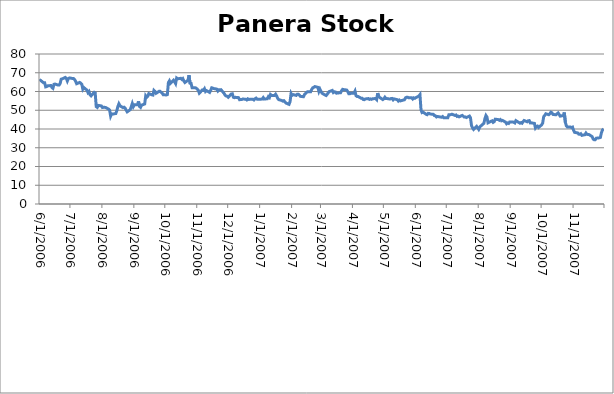
| Category | Panera Stock Price |
|---|---|
| 6/1/06 | 65.53 |
| 6/2/06 | 65.95 |
| 6/5/06 | 64.62 |
| 6/6/06 | 64.62 |
| 6/7/06 | 62.47 |
| 6/8/06 | 62.62 |
| 6/9/06 | 63.04 |
| 6/12/06 | 63.18 |
| 6/13/06 | 62.14 |
| 6/14/06 | 61.7 |
| 6/15/06 | 63.83 |
| 6/16/06 | 63.99 |
| 6/19/06 | 63.41 |
| 6/20/06 | 63.42 |
| 6/21/06 | 64.29 |
| 6/22/06 | 66.57 |
| 6/23/06 | 66.73 |
| 6/26/06 | 67.5 |
| 6/27/06 | 67.03 |
| 6/28/06 | 65.58 |
| 6/29/06 | 66.87 |
| 6/30/06 | 67.24 |
| 7/3/06 | 66.94 |
| 7/4/06 | 66.94 |
| 7/5/06 | 66.37 |
| 7/6/06 | 65.5 |
| 7/7/06 | 64.15 |
| 7/10/06 | 64.83 |
| 7/11/06 | 64.44 |
| 7/12/06 | 63.83 |
| 7/13/06 | 61.25 |
| 7/14/06 | 62.1 |
| 7/17/06 | 60.71 |
| 7/18/06 | 59.41 |
| 7/19/06 | 60.01 |
| 7/20/06 | 58.25 |
| 7/21/06 | 57.69 |
| 7/24/06 | 59.56 |
| 7/25/06 | 59.27 |
| 7/26/06 | 51.93 |
| 7/27/06 | 51.53 |
| 7/28/06 | 52.59 |
| 7/31/06 | 52.31 |
| 8/1/06 | 51.45 |
| 8/2/06 | 51.54 |
| 8/3/06 | 51.56 |
| 8/4/06 | 51.5 |
| 8/7/06 | 50.61 |
| 8/8/06 | 50.1 |
| 8/9/06 | 46.85 |
| 8/10/06 | 48.08 |
| 8/11/06 | 47.95 |
| 8/14/06 | 48.26 |
| 8/15/06 | 49.81 |
| 8/16/06 | 51.96 |
| 8/17/06 | 53.46 |
| 8/18/06 | 52.4 |
| 8/21/06 | 51.39 |
| 8/22/06 | 51.62 |
| 8/23/06 | 51.15 |
| 8/24/06 | 50.12 |
| 8/25/06 | 49.16 |
| 8/28/06 | 50.29 |
| 8/29/06 | 51.9 |
| 8/30/06 | 53.6 |
| 8/31/06 | 51.9 |
| 9/1/06 | 52.88 |
| 9/4/06 | 52.88 |
| 9/5/06 | 54.75 |
| 9/6/06 | 52.03 |
| 9/7/06 | 51.52 |
| 9/8/06 | 52.72 |
| 9/11/06 | 53.35 |
| 9/12/06 | 57.67 |
| 9/13/06 | 56.89 |
| 9/14/06 | 57.46 |
| 9/15/06 | 58.9 |
| 9/18/06 | 58.22 |
| 9/19/06 | 58.09 |
| 9/20/06 | 60.6 |
| 9/21/06 | 60.08 |
| 9/22/06 | 59.03 |
| 9/25/06 | 60.11 |
| 9/26/06 | 60.11 |
| 9/27/06 | 59.57 |
| 9/28/06 | 59.1 |
| 9/29/06 | 58.25 |
| 10/2/06 | 58.17 |
| 10/3/06 | 58.35 |
| 10/4/06 | 64.75 |
| 10/5/06 | 65.68 |
| 10/6/06 | 64.41 |
| 10/9/06 | 66.02 |
| 10/10/06 | 65.19 |
| 10/11/06 | 64.22 |
| 10/12/06 | 67.2 |
| 10/13/06 | 66.8 |
| 10/16/06 | 67.03 |
| 10/17/06 | 66.47 |
| 10/18/06 | 66.9 |
| 10/19/06 | 65.58 |
| 10/20/06 | 64.79 |
| 10/23/06 | 66.01 |
| 10/24/06 | 68.7 |
| 10/25/06 | 64.41 |
| 10/26/06 | 64.33 |
| 10/27/06 | 62.03 |
| 10/30/06 | 61.98 |
| 10/31/06 | 61.8 |
| 11/1/06 | 61.27 |
| 11/2/06 | 60.66 |
| 11/3/06 | 59.15 |
| 11/6/06 | 60.83 |
| 11/7/06 | 60.64 |
| 11/8/06 | 61.47 |
| 11/9/06 | 59.99 |
| 11/10/06 | 60.47 |
| 11/13/06 | 59.52 |
| 11/14/06 | 60.58 |
| 11/15/06 | 61.97 |
| 11/16/06 | 61.82 |
| 11/17/06 | 61.58 |
| 11/20/06 | 61.26 |
| 11/21/06 | 60.25 |
| 11/22/06 | 60.87 |
| 11/23/06 | 60.87 |
| 11/24/06 | 60.97 |
| 11/27/06 | 59 |
| 11/28/06 | 58.08 |
| 11/29/06 | 57.6 |
| 11/30/06 | 57.45 |
| 12/1/06 | 56.9 |
| 12/4/06 | 58.68 |
| 12/5/06 | 58.79 |
| 12/6/06 | 56.94 |
| 12/7/06 | 56.7 |
| 12/8/06 | 56.89 |
| 12/11/06 | 56.74 |
| 12/12/06 | 55.63 |
| 12/13/06 | 55.7 |
| 12/14/06 | 55.68 |
| 12/15/06 | 55.97 |
| 12/18/06 | 55.9 |
| 12/19/06 | 55.52 |
| 12/20/06 | 56.08 |
| 12/21/06 | 55.77 |
| 12/22/06 | 55.82 |
| 12/25/06 | 55.82 |
| 12/26/06 | 55.47 |
| 12/27/06 | 56.1 |
| 12/28/06 | 56.47 |
| 12/29/06 | 55.91 |
| 1/1/07 | 55.91 |
| 1/2/07 | 55.91 |
| 1/3/07 | 56.01 |
| 1/4/07 | 56.75 |
| 1/5/07 | 55.95 |
| 1/8/07 | 56.15 |
| 1/9/07 | 57.27 |
| 1/10/07 | 56.79 |
| 1/11/07 | 58.4 |
| 1/12/07 | 57.92 |
| 1/15/07 | 57.92 |
| 1/16/07 | 58.54 |
| 1/17/07 | 57.63 |
| 1/18/07 | 56.38 |
| 1/19/07 | 55.67 |
| 1/22/07 | 55.2 |
| 1/23/07 | 54.87 |
| 1/24/07 | 55.11 |
| 1/25/07 | 54.5 |
| 1/26/07 | 53.85 |
| 1/29/07 | 53.15 |
| 1/30/07 | 54.58 |
| 1/31/07 | 58.96 |
| 2/1/07 | 57.93 |
| 2/2/07 | 58.34 |
| 2/5/07 | 57.93 |
| 2/6/07 | 58.55 |
| 2/7/07 | 58.57 |
| 2/8/07 | 58.12 |
| 2/9/07 | 57.41 |
| 2/12/07 | 57.2 |
| 2/13/07 | 58.4 |
| 2/14/07 | 58.92 |
| 2/15/07 | 59.47 |
| 2/16/07 | 59.91 |
| 2/19/07 | 59.91 |
| 2/20/07 | 61.11 |
| 2/21/07 | 61.97 |
| 2/22/07 | 62.2 |
| 2/23/07 | 62.63 |
| 2/26/07 | 62.23 |
| 2/27/07 | 60 |
| 2/28/07 | 61.23 |
| 3/1/07 | 60.07 |
| 3/2/07 | 59.1 |
| 3/5/07 | 58.13 |
| 3/6/07 | 57.84 |
| 3/7/07 | 58.48 |
| 3/8/07 | 59.29 |
| 3/9/07 | 59.95 |
| 3/12/07 | 60.57 |
| 3/13/07 | 59.46 |
| 3/14/07 | 59.84 |
| 3/15/07 | 59.74 |
| 3/16/07 | 59.1 |
| 3/19/07 | 59.32 |
| 3/20/07 | 59.35 |
| 3/21/07 | 60.42 |
| 3/22/07 | 61.16 |
| 3/23/07 | 61.02 |
| 3/26/07 | 60.77 |
| 3/27/07 | 59.95 |
| 3/28/07 | 58.78 |
| 3/29/07 | 58.76 |
| 3/30/07 | 59.06 |
| 4/2/07 | 59.09 |
| 4/3/07 | 60.22 |
| 4/4/07 | 57.75 |
| 4/5/07 | 57.34 |
| 4/6/07 | 57.34 |
| 4/9/07 | 56.39 |
| 4/10/07 | 56.38 |
| 4/11/07 | 55.73 |
| 4/12/07 | 55.64 |
| 4/13/07 | 56.03 |
| 4/16/07 | 56.23 |
| 4/17/07 | 55.79 |
| 4/18/07 | 56.05 |
| 4/19/07 | 55.83 |
| 4/20/07 | 56.14 |
| 4/23/07 | 56.25 |
| 4/24/07 | 55.7 |
| 4/25/07 | 59.13 |
| 4/26/07 | 57.45 |
| 4/27/07 | 56.8 |
| 4/30/07 | 55.69 |
| 5/1/07 | 56.1 |
| 5/2/07 | 56.94 |
| 5/3/07 | 56.24 |
| 5/4/07 | 56.24 |
| 5/7/07 | 55.95 |
| 5/8/07 | 56.24 |
| 5/9/07 | 56.3 |
| 5/10/07 | 55.52 |
| 5/11/07 | 56.05 |
| 5/14/07 | 55.65 |
| 5/15/07 | 54.94 |
| 5/16/07 | 55.43 |
| 5/17/07 | 54.99 |
| 5/18/07 | 55.15 |
| 5/21/07 | 55.59 |
| 5/22/07 | 56.62 |
| 5/23/07 | 56.92 |
| 5/24/07 | 56.97 |
| 5/25/07 | 56.67 |
| 5/28/07 | 56.67 |
| 5/29/07 | 56 |
| 5/30/07 | 56.6 |
| 5/31/07 | 56.37 |
| 6/1/07 | 56.73 |
| 6/4/07 | 57.59 |
| 6/5/07 | 58.32 |
| 6/6/07 | 50.28 |
| 6/7/07 | 48.78 |
| 6/8/07 | 49.01 |
| 6/11/07 | 47.85 |
| 6/12/07 | 47.64 |
| 6/13/07 | 48.33 |
| 6/14/07 | 48.29 |
| 6/15/07 | 47.98 |
| 6/18/07 | 47.82 |
| 6/19/07 | 47.15 |
| 6/20/07 | 47.04 |
| 6/21/07 | 46.41 |
| 6/22/07 | 46.69 |
| 6/25/07 | 46.35 |
| 6/26/07 | 46.29 |
| 6/27/07 | 46.65 |
| 6/28/07 | 46.02 |
| 6/29/07 | 46.06 |
| 7/2/07 | 46.02 |
| 7/3/07 | 47.55 |
| 7/4/07 | 47.55 |
| 7/5/07 | 47.68 |
| 7/6/07 | 47.9 |
| 7/9/07 | 47.23 |
| 7/10/07 | 47.48 |
| 7/11/07 | 46.7 |
| 7/12/07 | 46.87 |
| 7/13/07 | 46.49 |
| 7/16/07 | 47.26 |
| 7/17/07 | 46.83 |
| 7/18/07 | 46.37 |
| 7/19/07 | 46.45 |
| 7/20/07 | 46.1 |
| 7/23/07 | 46.9 |
| 7/24/07 | 45.98 |
| 7/25/07 | 41.81 |
| 7/26/07 | 40.58 |
| 7/27/07 | 39.79 |
| 7/30/07 | 41.38 |
| 7/31/07 | 40.64 |
| 8/1/07 | 39.8 |
| 8/2/07 | 41 |
| 8/3/07 | 41.58 |
| 8/6/07 | 43.04 |
| 8/7/07 | 45.56 |
| 8/8/07 | 47.19 |
| 8/9/07 | 46.37 |
| 8/10/07 | 43.31 |
| 8/13/07 | 44.1 |
| 8/14/07 | 44.36 |
| 8/15/07 | 43.54 |
| 8/16/07 | 43.91 |
| 8/17/07 | 45.23 |
| 8/20/07 | 45 |
| 8/21/07 | 44.65 |
| 8/22/07 | 45.04 |
| 8/23/07 | 44.39 |
| 8/24/07 | 44.59 |
| 8/27/07 | 43.69 |
| 8/28/07 | 42.8 |
| 8/29/07 | 43.21 |
| 8/30/07 | 42.96 |
| 8/31/07 | 43.74 |
| 9/3/07 | 43.74 |
| 9/4/07 | 43.59 |
| 9/5/07 | 43.24 |
| 9/6/07 | 44.46 |
| 9/7/07 | 44.13 |
| 9/10/07 | 43.1 |
| 9/11/07 | 43.4 |
| 9/12/07 | 43.08 |
| 9/13/07 | 43.93 |
| 9/14/07 | 44.53 |
| 9/17/07 | 43.87 |
| 9/18/07 | 44.39 |
| 9/19/07 | 44.48 |
| 9/20/07 | 43.26 |
| 9/21/07 | 43.28 |
| 9/24/07 | 43 |
| 9/25/07 | 40.59 |
| 9/26/07 | 41.36 |
| 9/27/07 | 41.56 |
| 9/28/07 | 40.8 |
| 10/1/07 | 42.19 |
| 10/2/07 | 43.12 |
| 10/3/07 | 46.57 |
| 10/4/07 | 47.27 |
| 10/5/07 | 48.11 |
| 10/8/07 | 47.62 |
| 10/9/07 | 48.19 |
| 10/10/07 | 48.95 |
| 10/11/07 | 48.66 |
| 10/12/07 | 47.77 |
| 10/15/07 | 47.57 |
| 10/16/07 | 48.12 |
| 10/17/07 | 48.57 |
| 10/18/07 | 47.82 |
| 10/19/07 | 46.85 |
| 10/22/07 | 47.2 |
| 10/23/07 | 48.81 |
| 10/24/07 | 43.61 |
| 10/25/07 | 41.66 |
| 10/26/07 | 41.05 |
| 10/29/07 | 41.01 |
| 10/30/07 | 40.73 |
| 10/31/07 | 40.99 |
| 11/1/07 | 39.28 |
| 11/2/07 | 38.21 |
| 11/5/07 | 37.89 |
| 11/6/07 | 37.25 |
| 11/7/07 | 37.19 |
| 11/8/07 | 37.48 |
| 11/9/07 | 36.62 |
| 11/12/07 | 36.96 |
| 11/13/07 | 37.85 |
| 11/14/07 | 37.14 |
| 11/15/07 | 37.11 |
| 11/16/07 | 37.01 |
| 11/19/07 | 35.91 |
| 11/20/07 | 34.64 |
| 11/21/07 | 34.27 |
| 11/22/07 | 34.27 |
| 11/23/07 | 35.09 |
| 11/26/07 | 35.29 |
| 11/27/07 | 35.51 |
| 11/28/07 | 38.01 |
| 11/29/07 | 39.47 |
| 11/30/07 | 40.07 |